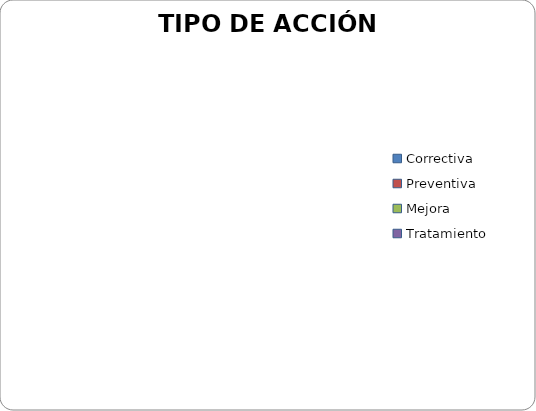
| Category | TIPO DE ACCIÓN GENERADA |
|---|---|
| Correctiva | 0 |
| Preventiva | 0 |
| Mejora | 0 |
| Tratamiento | 0 |